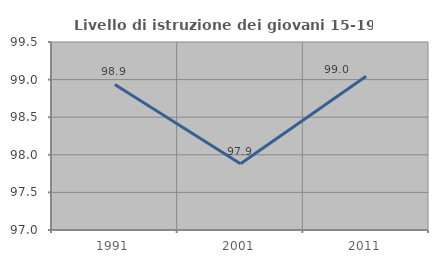
| Category | Livello di istruzione dei giovani 15-19 anni |
|---|---|
| 1991.0 | 98.936 |
| 2001.0 | 97.88 |
| 2011.0 | 99.045 |